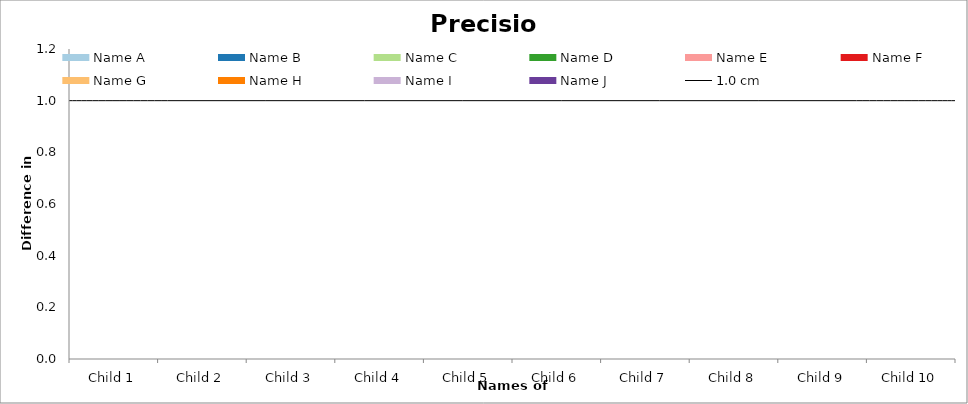
| Category | Name A | Name B | Name C | Name D | Name E | Name F | Name G | Name H | Name I | Name J |
|---|---|---|---|---|---|---|---|---|---|---|
| 0 | 0 | 0 | 0 | 0 | 0 | 0 | 0 | 0 | 0 | 0 |
| 1 | 0 | 0 | 0 | 0 | 0 | 0 | 0 | 0 | 0 | 0 |
| 2 | 0 | 0 | 0 | 0 | 0 | 0 | 0 | 0 | 0 | 0 |
| 3 | 0 | 0 | 0 | 0 | 0 | 0 | 0 | 0 | 0 | 0 |
| 4 | 0 | 0 | 0 | 0 | 0 | 0 | 0 | 0 | 0 | 0 |
| 5 | 0 | 0 | 0 | 0 | 0 | 0 | 0 | 0 | 0 | 0 |
| 6 | 0 | 0 | 0 | 0 | 0 | 0 | 0 | 0 | 0 | 0 |
| 7 | 0 | 0 | 0 | 0 | 0 | 0 | 0 | 0 | 0 | 0 |
| 8 | 0 | 0 | 0 | 0 | 0 | 0 | 0 | 0 | 0 | 0 |
| 9 | 0 | 0 | 0 | 0 | 0 | 0 | 0 | 0 | 0 | 0 |